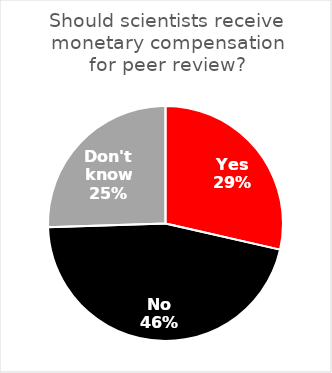
| Category | Should scientists receive monetary compensation for peer review? |
|---|---|
| Yes | 84 |
| No | 135 |
| Don't know | 75 |